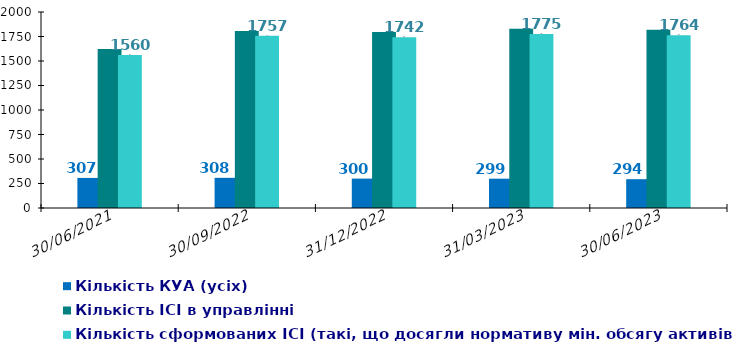
| Category | Кількість КУА (усіх) | Кількість КУА з ІСІ в управлінні | Кількість ІСІ в управлінні  | Кількість сформованих ІСІ (такі, що досягли нормативу мін. обсягу активів)  |
|---|---|---|---|---|
| 30/06/2021 | 307 |  | 1623 | 1560 |
| 30/09/2022 | 308 |  | 1807 | 1757 |
| 31/12/2022 | 300 |  | 1795 | 1742 |
| 31/03/2023 | 299 |  | 1828 | 1775 |
| 30/06/2023 | 294 |  | 1819 | 1764 |